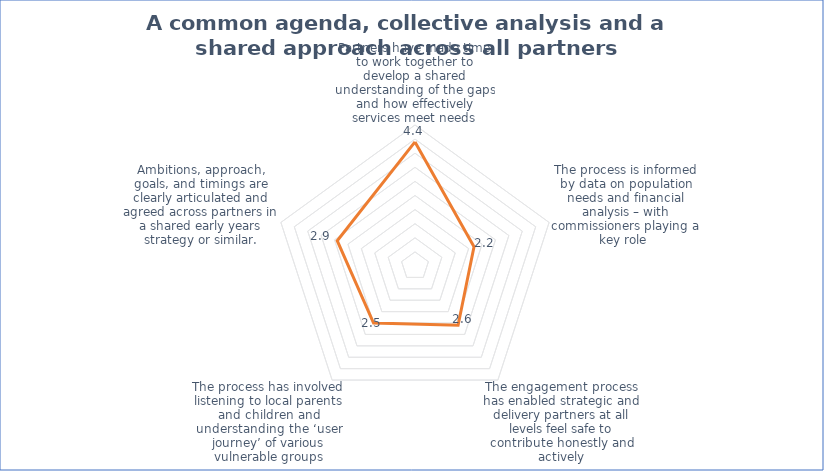
| Category | Series 0 |
|---|---|
| Partners have made time to work together to develop a shared understanding of the gaps and how effectively services meet needs | 4.4 |
| The process is informed by data on population needs and financial analysis – with commissioners playing a key role  | 2.2 |
| The engagement process has enabled strategic and delivery partners at all levels feel safe to contribute honestly and actively | 2.6 |
| The process has involved listening to local parents and children and understanding the ‘user journey’ of various vulnerable groups | 2.5 |
| Ambitions, approach, goals, and timings are clearly articulated and agreed across partners in a shared early years strategy or similar. | 2.9 |